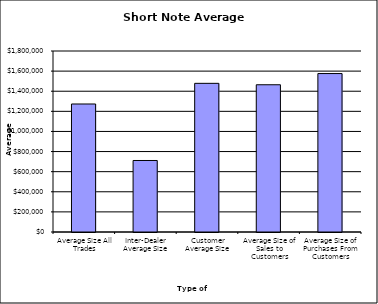
| Category | Security Type |
|---|---|
| Average Size All Trades | 1272969.966 |
| Inter-Dealer Average Size | 711134.035 |
| Customer Average Size | 1478372.349 |
| Average Size of Sales to Customers | 1464330.999 |
| Average Size of Purchases From Customers | 1575682.171 |